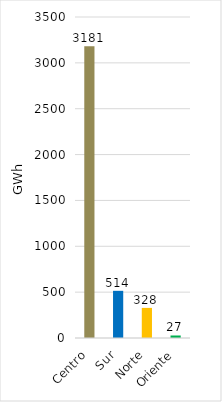
| Category | Series 0 |
|---|---|
| Centro | 3180.989 |
| Sur | 514.39 |
| Norte | 328.231 |
| Oriente | 27.365 |